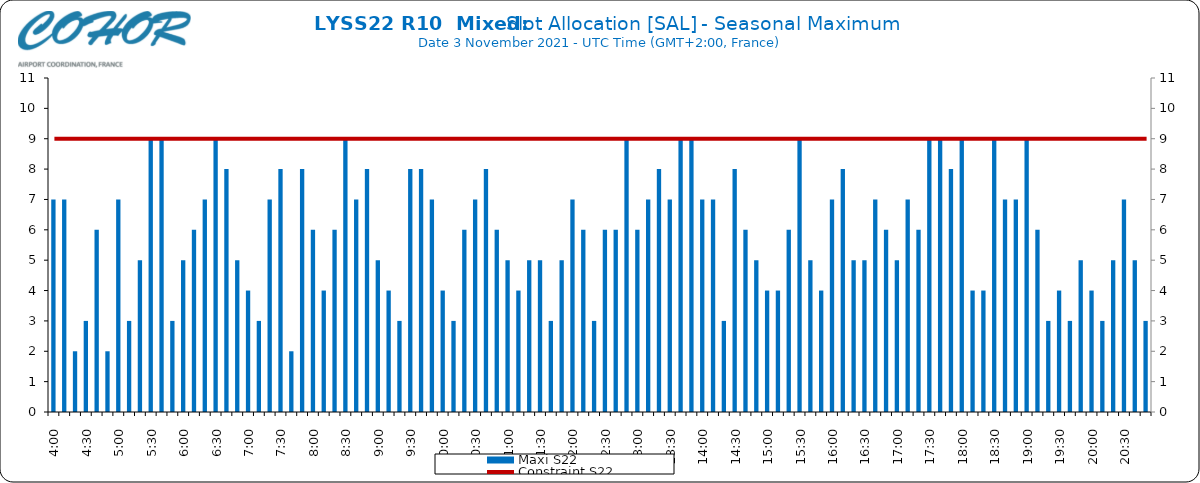
| Category | Maxi S22 |
|---|---|
| 0.16666666666666666 | 7 |
| 0.17361111111111113 | 7 |
| 0.18055555555555555 | 2 |
| 0.1875 | 3 |
| 0.19444444444444445 | 6 |
| 0.20138888888888887 | 2 |
| 0.20833333333333334 | 7 |
| 0.2152777777777778 | 3 |
| 0.2222222222222222 | 5 |
| 0.22916666666666666 | 9 |
| 0.23611111111111113 | 9 |
| 0.24305555555555555 | 3 |
| 0.25 | 5 |
| 0.2569444444444445 | 6 |
| 0.2638888888888889 | 7 |
| 0.2708333333333333 | 9 |
| 0.2777777777777778 | 8 |
| 0.2847222222222222 | 5 |
| 0.2916666666666667 | 4 |
| 0.2986111111111111 | 3 |
| 0.3055555555555555 | 7 |
| 0.3125 | 8 |
| 0.3194444444444445 | 2 |
| 0.3263888888888889 | 8 |
| 0.3333333333333333 | 6 |
| 0.34027777777777773 | 4 |
| 0.34722222222222227 | 6 |
| 0.3541666666666667 | 9 |
| 0.3611111111111111 | 7 |
| 0.3680555555555556 | 8 |
| 0.375 | 5 |
| 0.3819444444444444 | 4 |
| 0.3888888888888889 | 3 |
| 0.3958333333333333 | 8 |
| 0.40277777777777773 | 8 |
| 0.40972222222222227 | 7 |
| 0.4166666666666667 | 4 |
| 0.4236111111111111 | 3 |
| 0.4305555555555556 | 6 |
| 0.4375 | 7 |
| 0.4444444444444444 | 8 |
| 0.4513888888888889 | 6 |
| 0.4583333333333333 | 5 |
| 0.46527777777777773 | 4 |
| 0.47222222222222227 | 5 |
| 0.4791666666666667 | 5 |
| 0.4861111111111111 | 3 |
| 0.4930555555555556 | 5 |
| 0.5 | 7 |
| 0.5069444444444444 | 6 |
| 0.513888888888889 | 3 |
| 0.5208333333333334 | 6 |
| 0.5277777777777778 | 6 |
| 0.5347222222222222 | 9 |
| 0.5416666666666666 | 6 |
| 0.548611111111111 | 7 |
| 0.5555555555555556 | 8 |
| 0.5625 | 7 |
| 0.5694444444444444 | 9 |
| 0.576388888888889 | 9 |
| 0.5833333333333334 | 7 |
| 0.5902777777777778 | 7 |
| 0.5972222222222222 | 3 |
| 0.6041666666666666 | 8 |
| 0.611111111111111 | 6 |
| 0.6180555555555556 | 5 |
| 0.625 | 4 |
| 0.6319444444444444 | 4 |
| 0.638888888888889 | 6 |
| 0.6458333333333334 | 9 |
| 0.6527777777777778 | 5 |
| 0.6597222222222222 | 4 |
| 0.6666666666666666 | 7 |
| 0.6736111111111112 | 8 |
| 0.6805555555555555 | 5 |
| 0.6875 | 5 |
| 0.6944444444444445 | 7 |
| 0.7013888888888888 | 6 |
| 0.7083333333333334 | 5 |
| 0.7152777777777778 | 7 |
| 0.7222222222222222 | 6 |
| 0.7291666666666666 | 9 |
| 0.7361111111111112 | 9 |
| 0.7430555555555555 | 8 |
| 0.75 | 9 |
| 0.7569444444444445 | 4 |
| 0.7638888888888888 | 4 |
| 0.7708333333333334 | 9 |
| 0.7777777777777778 | 7 |
| 0.7847222222222222 | 7 |
| 0.7916666666666666 | 9 |
| 0.7986111111111112 | 6 |
| 0.8055555555555555 | 3 |
| 0.8125 | 4 |
| 0.8194444444444445 | 3 |
| 0.8263888888888888 | 5 |
| 0.8333333333333334 | 4 |
| 0.8402777777777778 | 3 |
| 0.8472222222222222 | 5 |
| 0.8541666666666666 | 7 |
| 0.8611111111111112 | 5 |
| 0.8680555555555555 | 3 |